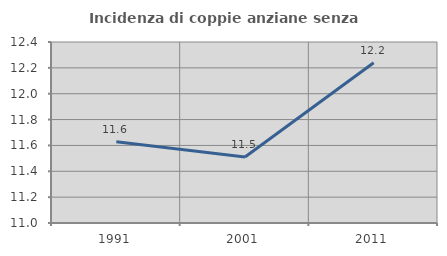
| Category | Incidenza di coppie anziane senza figli  |
|---|---|
| 1991.0 | 11.628 |
| 2001.0 | 11.511 |
| 2011.0 | 12.239 |